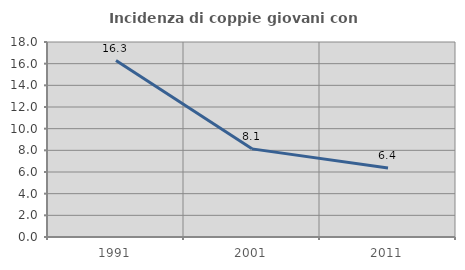
| Category | Incidenza di coppie giovani con figli |
|---|---|
| 1991.0 | 16.291 |
| 2001.0 | 8.136 |
| 2011.0 | 6.368 |